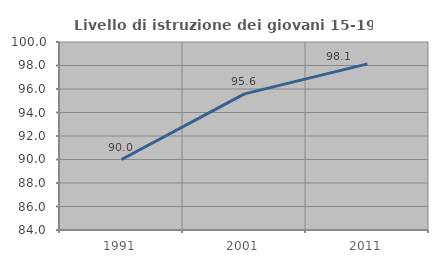
| Category | Livello di istruzione dei giovani 15-19 anni |
|---|---|
| 1991.0 | 90 |
| 2001.0 | 95.584 |
| 2011.0 | 98.138 |